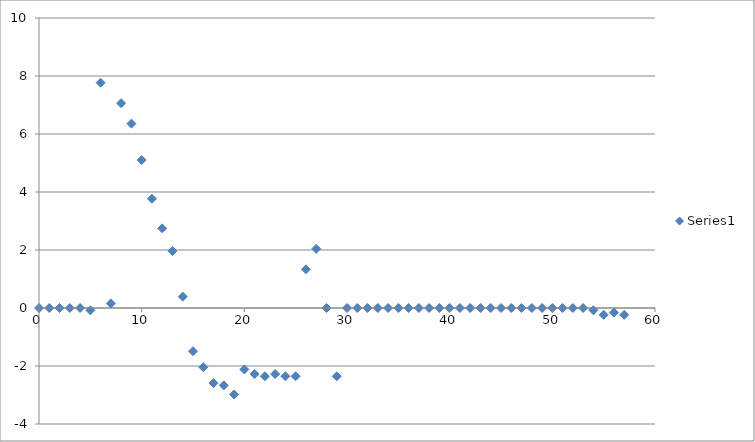
| Category | Series 0 |
|---|---|
| 0.0 | 0 |
| 1.0 | 0 |
| 2.0 | 0 |
| 3.0 | 0 |
| 4.0 | 0 |
| 5.0 | -0.078 |
| 6.0 | 7.77 |
| 7.0 | 0.157 |
| 8.0 | 7.063 |
| 9.0 | 6.357 |
| 10.0 | 5.101 |
| 11.0 | 3.767 |
| 12.0 | 2.747 |
| 13.0 | 1.962 |
| 14.0 | 0.392 |
| 15.0 | -1.491 |
| 16.0 | -2.041 |
| 17.0 | -2.59 |
| 18.0 | -2.668 |
| 19.0 | -2.982 |
| 20.0 | -2.119 |
| 21.0 | -2.276 |
| 22.0 | -2.354 |
| 23.0 | -2.276 |
| 24.0 | -2.354 |
| 25.0 | -2.354 |
| 26.0 | 1.334 |
| 27.0 | 2.041 |
| 28.0 | 0 |
| 29.0 | -2.354 |
| 30.0 | 0 |
| 31.0 | 0 |
| 32.0 | 0 |
| 33.0 | 0 |
| 34.0 | 0 |
| 35.0 | 0 |
| 36.0 | 0 |
| 37.0 | 0 |
| 38.0 | 0 |
| 39.0 | 0 |
| 40.0 | 0 |
| 41.0 | 0 |
| 42.0 | 0 |
| 43.0 | 0 |
| 44.0 | 0 |
| 45.0 | 0 |
| 46.0 | 0 |
| 47.0 | 0 |
| 48.0 | 0 |
| 49.0 | 0 |
| 50.0 | 0 |
| 51.0 | 0 |
| 52.0 | 0 |
| 53.0 | 0 |
| 54.0 | -0.078 |
| 55.0 | -0.235 |
| 56.0 | -0.157 |
| 57.0 | -0.235 |